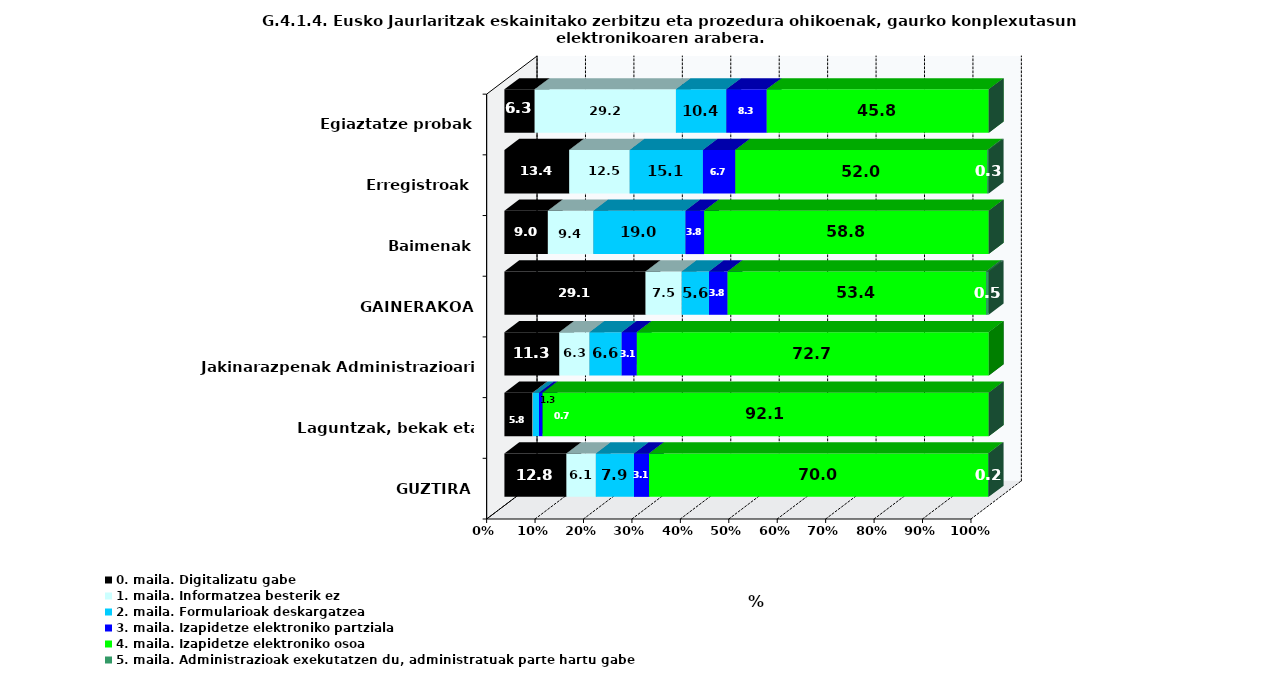
| Category | 0. maila. Digitalizatu gabe | 1. maila. Informatzea besterik ez | 2. maila. Formularioak deskargatzea | 3. maila. Izapidetze elektroniko partziala | 4. maila. Izapidetze elektroniko osoa | 5. maila. Administrazioak exekutatzen du, administratuak parte hartu gabe |
|---|---|---|---|---|---|---|
| GUZTIRA | 12.806 | 6.078 | 7.875 | 3.096 | 69.992 | 0.153 |
| Laguntzak, bekak eta diru-laguntzak | 5.783 | 0.105 | 1.262 | 0.736 | 92.114 | 0 |
| Jakinarazpenak Administrazioari | 11.328 | 6.25 | 6.641 | 3.125 | 72.656 | 0 |
| GAINERAKOA | 29.144 | 7.468 | 5.647 | 3.825 | 53.37 | 0.546 |
| Baimenak | 8.974 | 9.402 | 19.017 | 3.846 | 58.761 | 0 |
| Erregistroak | 13.372 | 12.5 | 15.116 | 6.686 | 52.035 | 0.291 |
| Egiaztatze probak | 6.25 | 29.167 | 10.417 | 8.333 | 45.833 | 0 |